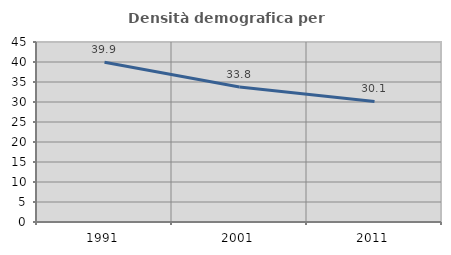
| Category | Densità demografica |
|---|---|
| 1991.0 | 39.941 |
| 2001.0 | 33.757 |
| 2011.0 | 30.149 |